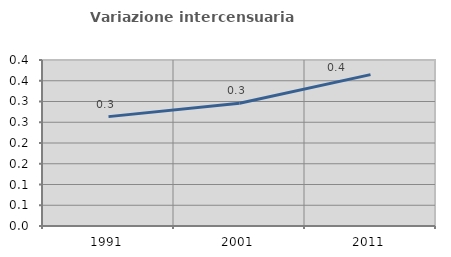
| Category | Variazione intercensuaria annua |
|---|---|
| 1991.0 | 0.264 |
| 2001.0 | 0.296 |
| 2011.0 | 0.365 |